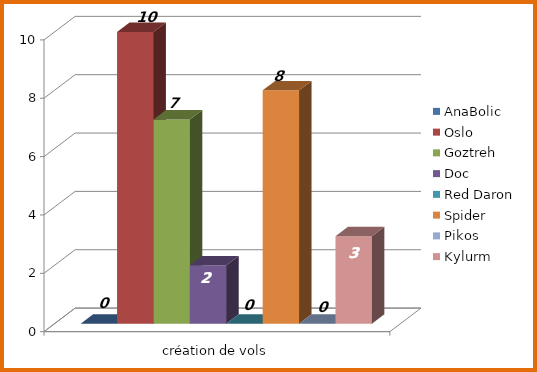
| Category | AnaBolic | Oslo | Goztreh | Doc | Red Daron | Spider | Pikos | Kylurm |
|---|---|---|---|---|---|---|---|---|
| 0 | 0 | 10 | 7 | 2 | 0 | 8 | 0 | 3 |